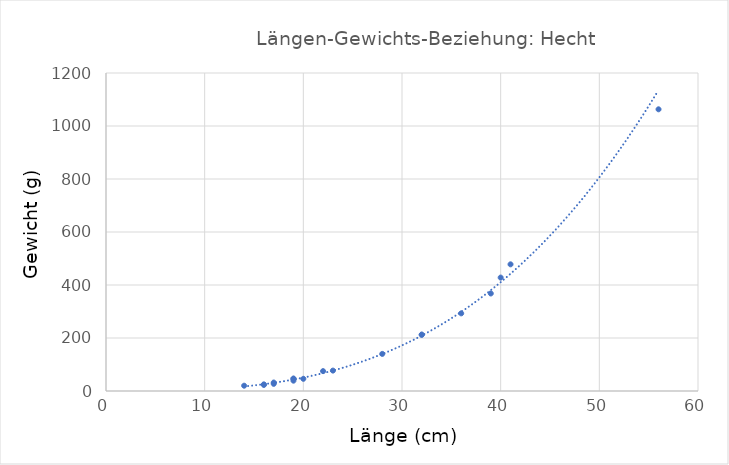
| Category | L-G-B Hecht |
|---|---|
| 14.0 | 20 |
| 16.0 | 23 |
| 16.0 | 25 |
| 17.0 | 27 |
| 17.0 | 32 |
| 19.0 | 39 |
| 19.0 | 46 |
| 19.0 | 47 |
| 20.0 | 46 |
| 22.0 | 75 |
| 23.0 | 77 |
| 28.0 | 140 |
| 32.0 | 212 |
| 32.0 | 213 |
| 36.0 | 293 |
| 39.0 | 368 |
| 40.0 | 428 |
| 41.0 | 478 |
| 56.0 | 1063 |